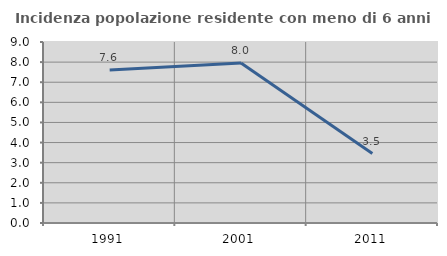
| Category | Incidenza popolazione residente con meno di 6 anni |
|---|---|
| 1991.0 | 7.605 |
| 2001.0 | 7.957 |
| 2011.0 | 3.455 |